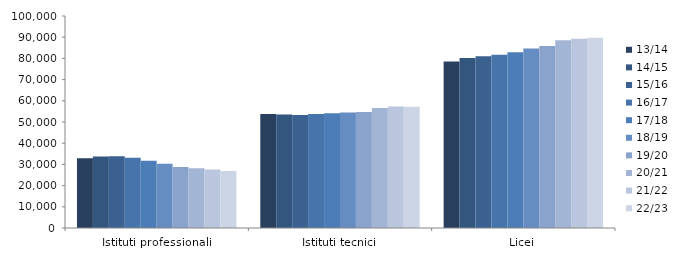
| Category | 13/14 | 14/15 | 15/16 | 16/17 | 17/18 | 18/19 | 19/20 | 20/21 | 21/22 | 22/23 |
|---|---|---|---|---|---|---|---|---|---|---|
| Istituti professionali | 32940 | 33749 | 33805 | 33079 | 31680 | 30276 | 28805 | 28141 | 27539 | 26832 |
| Istituti tecnici | 53716 | 53502 | 53327 | 53766 | 54121 | 54432 | 54729 | 56653 | 57341 | 57135 |
| Licei | 78552 | 80234 | 81073 | 81747 | 82932 | 84694 | 85850 | 88614 | 89245 | 89703 |